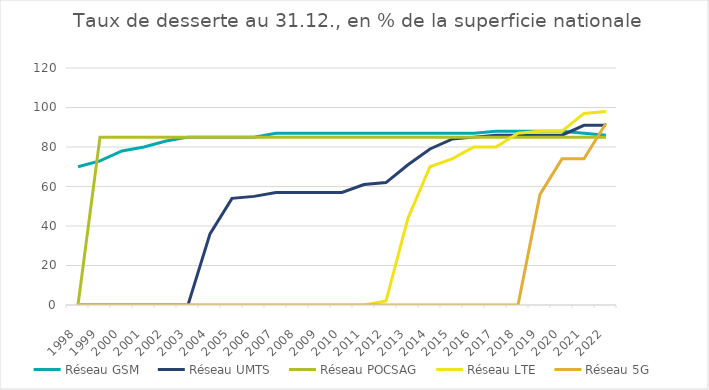
| Category | Réseau GSM | Réseau UMTS | Réseau POCSAG | Réseau LTE | Réseau 5G |
|---|---|---|---|---|---|
| 1998.0 | 70 | 0 | 0 | 0 | 0 |
| 1999.0 | 73 | 0 | 85 | 0 | 0 |
| 2000.0 | 78 | 0 | 85 | 0 | 0 |
| 2001.0 | 80 | 0 | 85 | 0 | 0 |
| 2002.0 | 83 | 0 | 85 | 0 | 0 |
| 2003.0 | 85 | 0 | 85 | 0 | 0 |
| 2004.0 | 85 | 36 | 85 | 0 | 0 |
| 2005.0 | 85 | 54 | 85 | 0 | 0 |
| 2006.0 | 85 | 55 | 85 | 0 | 0 |
| 2007.0 | 87 | 57 | 85 | 0 | 0 |
| 2008.0 | 87 | 57 | 85 | 0 | 0 |
| 2009.0 | 87 | 57 | 85 | 0 | 0 |
| 2010.0 | 87 | 57 | 85 | 0 | 0 |
| 2011.0 | 87 | 61 | 85 | 0 | 0 |
| 2012.0 | 87 | 62 | 85 | 2 | 0 |
| 2013.0 | 87 | 71 | 85 | 44 | 0 |
| 2014.0 | 87 | 79 | 85 | 70 | 0 |
| 2015.0 | 87 | 84 | 85 | 74 | 0 |
| 2016.0 | 87 | 85 | 85 | 80 | 0 |
| 2017.0 | 88 | 86 | 85 | 80 | 0 |
| 2018.0 | 88 | 86 | 85 | 87 | 0 |
| 2019.0 | 88 | 86 | 85 | 88 | 56 |
| 2020.0 | 88 | 86 | 85 | 88 | 74 |
| 2021.0 | 87 | 91 | 85 | 97 | 74 |
| 2022.0 | 86 | 91 | 85 | 98 | 92 |